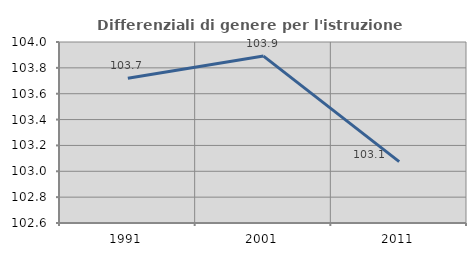
| Category | Differenziali di genere per l'istruzione superiore |
|---|---|
| 1991.0 | 103.72 |
| 2001.0 | 103.891 |
| 2011.0 | 103.074 |